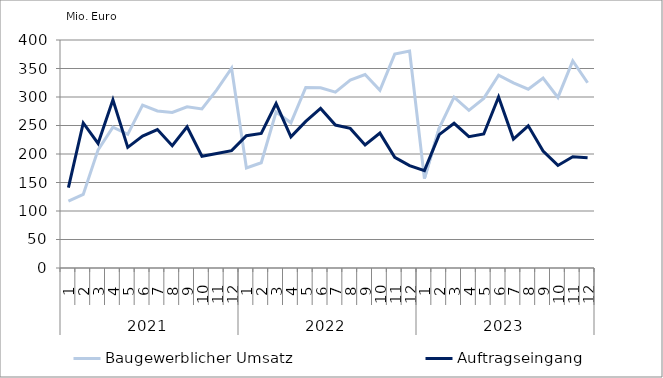
| Category | Baugewerblicher Umsatz | Auftragseingang |
|---|---|---|
| 0 | 117421.805 | 141020.655 |
| 1 | 129162.55 | 254416.876 |
| 2 | 207280.837 | 218451.405 |
| 3 | 247094.279 | 295077.868 |
| 4 | 234515.312 | 211696.129 |
| 5 | 285732.845 | 231455.155 |
| 6 | 275480.885 | 242932.505 |
| 7 | 272787.524 | 214636.944 |
| 8 | 282850.254 | 247827.991 |
| 9 | 279173.21 | 196069.238 |
| 10 | 312511.437 | 201015.897 |
| 11 | 350582.01 | 205949.991 |
| 12 | 175456.852 | 232178.255 |
| 13 | 184578.32 | 236006.862 |
| 14 | 273732.567 | 288451.109 |
| 15 | 254683.671 | 230228.968 |
| 16 | 316794.568 | 257235.39 |
| 17 | 316277.567 | 279900.179 |
| 18 | 308621.034 | 250827.343 |
| 19 | 329490.411 | 244949.341 |
| 20 | 339435.208 | 215809.075 |
| 21 | 311599.811 | 236674.056 |
| 22 | 375203.994 | 194107.214 |
| 23 | 380445.583 | 179631.624 |
| 24 | 156885.157 | 170764.939 |
| 25 | 245647.016 | 234064.391 |
| 26 | 299793.904 | 253873.168 |
| 27 | 276653.498 | 230304.701 |
| 28 | 297513.239 | 235047.978 |
| 29 | 338296.53 | 299989.264 |
| 30 | 324660.651 | 226217.704 |
| 31 | 313657.31 | 249461.868 |
| 32 | 333301.685 | 205148.229 |
| 33 | 299264.813 | 179932.548 |
| 34 | 363340.927 | 195334.324 |
| 35 | 325030.868 | 193483.388 |